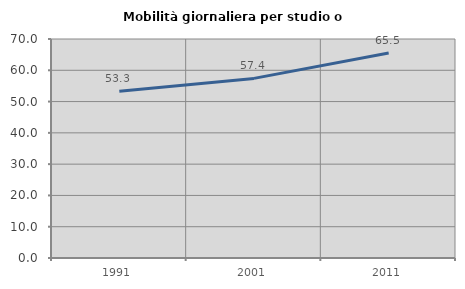
| Category | Mobilità giornaliera per studio o lavoro |
|---|---|
| 1991.0 | 53.297 |
| 2001.0 | 57.407 |
| 2011.0 | 65.53 |